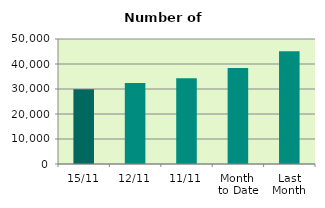
| Category | Series 0 |
|---|---|
| 15/11 | 29908 |
| 12/11 | 32386 |
| 11/11 | 34342 |
| Month 
to Date | 38415.636 |
| Last
Month | 45060.857 |